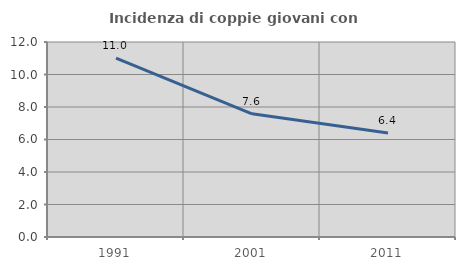
| Category | Incidenza di coppie giovani con figli |
|---|---|
| 1991.0 | 11.005 |
| 2001.0 | 7.583 |
| 2011.0 | 6.404 |